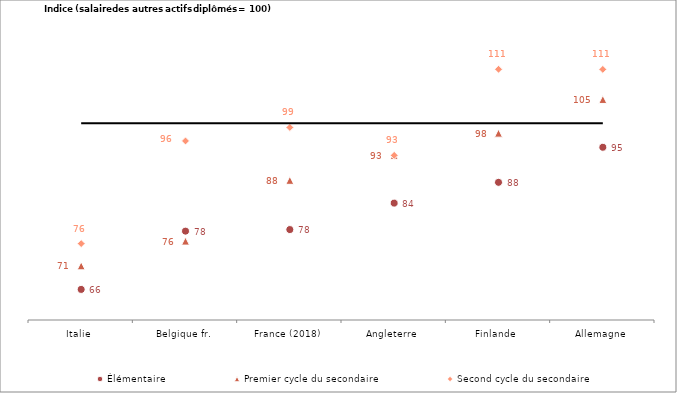
| Category | Élémentaire | Premier cycle du secondaire | Second cycle du secondaire | Salaire des autres actifs diplômés : indice 100  |
|---|---|---|---|---|
| Italie | 66.221 | 71.016 | 75.542 | 100 |
| Belgique fr. | 78.076 | 76.047 | 96.408 | 100 |
| France (2018) | 78.394 | 88.41 | 99.164 | 100 |
| Angleterre | 83.777 | 93.488 | 93.488 | 100 |
| Finlande | 88 | 98 | 111 | 100 |
| Allemagne | 95.132 | 104.859 | 110.97 | 100 |